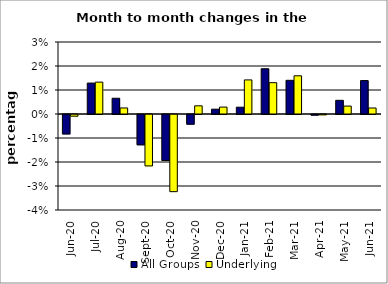
| Category | All Groups | Underlying |
|---|---|---|
| 2020-06-01 | -0.008 | -0.001 |
| 2020-07-01 | 0.013 | 0.013 |
| 2020-08-01 | 0.007 | 0.003 |
| 2020-09-01 | -0.013 | -0.021 |
| 2020-10-01 | -0.019 | -0.032 |
| 2020-11-01 | -0.004 | 0.003 |
| 2020-12-01 | 0.002 | 0.003 |
| 2021-01-01 | 0.003 | 0.014 |
| 2021-02-01 | 0.019 | 0.013 |
| 2021-03-01 | 0.014 | 0.016 |
| 2021-04-01 | 0 | 0 |
| 2021-05-01 | 0.006 | 0.003 |
| 2021-06-01 | 0.014 | 0.003 |